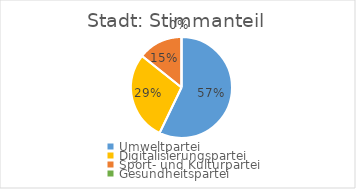
| Category | Stimmanteil |
|---|---|
| Umweltpartei | 0.571 |
| Digitalisierungspartei | 0.286 |
| Sport- und Kulturpartei | 0.143 |
| Gesundheitspartei | 0 |